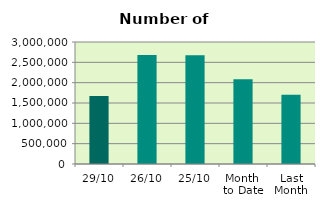
| Category | Series 0 |
|---|---|
| 29/10 | 1671490 |
| 26/10 | 2679598 |
| 25/10 | 2675034 |
| Month 
to Date | 2083668.476 |
| Last
Month | 1700207.9 |